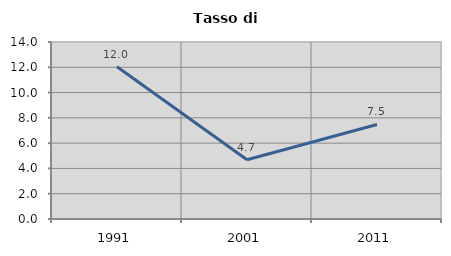
| Category | Tasso di disoccupazione   |
|---|---|
| 1991.0 | 12.044 |
| 2001.0 | 4.682 |
| 2011.0 | 7.477 |